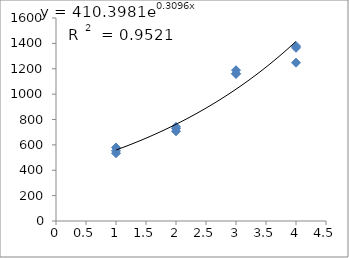
| Category | Series 0 |
|---|---|
| 1.0 | 579.46 |
| 1.0 | 533.965 |
| 1.0 | 553.121 |
| 2.0 | 742.702 |
| 2.0 | 707.335 |
| 2.0 | 729.439 |
| 3.0 | 1188.423 |
| 3.0 | 1160.35 |
| 3.0 | 1160.35 |
| 4.0 | 1247.512 |
| 4.0 | 1365.459 |
| 4.0 | 1379.068 |